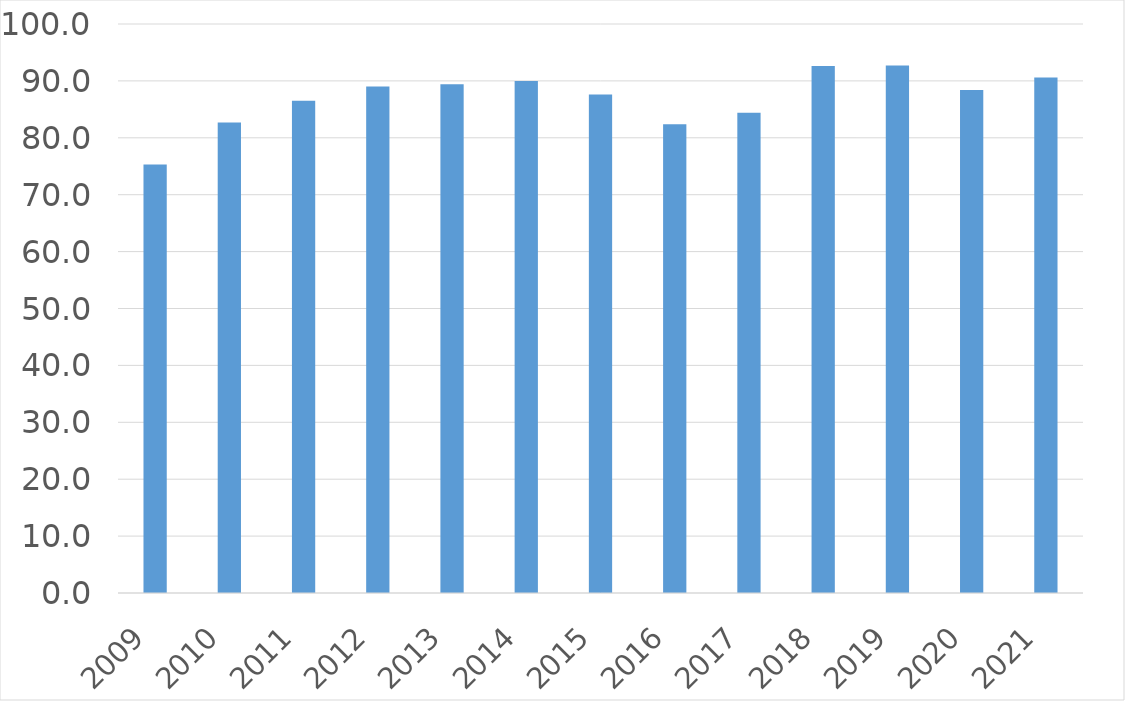
| Category | Series 0 |
|---|---|
| 2009 | 75.3 |
| 2010 | 82.7 |
| 2011 | 86.5 |
| 2012 | 89 |
| 2013 | 89.4 |
| 2014 | 90 |
| 2015 | 87.6 |
| 2016 | 82.4 |
| 2017 | 84.4 |
| 2018 | 92.6 |
| 2019 | 92.7 |
| 2020 | 88.4 |
| 2021 | 90.6 |